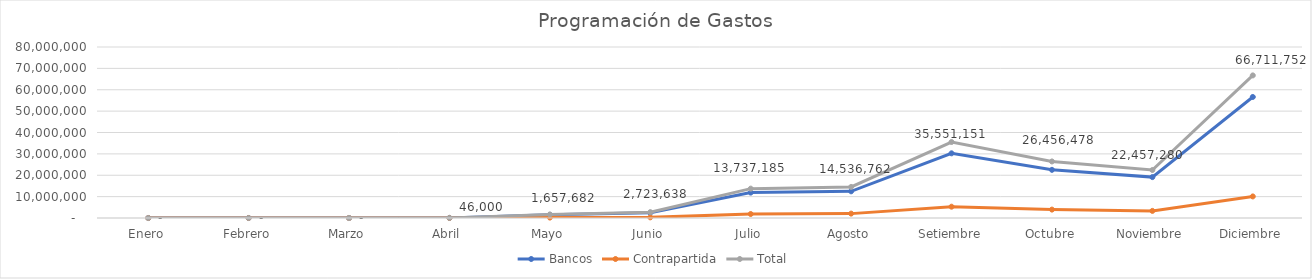
| Category | Bancos | Contrapartida | Total |
|---|---|---|---|
| Enero | 0 | 0 | 0 |
| Febrero | 0 | 0 | 0 |
| Marzo | 0 | 0 | 0 |
| Abril | 42593 | 3407 | 46000 |
| Mayo | 1464643.764 | 193037.944 | 1657681.709 |
| Junio | 2414125.31 | 309513.027 | 2723638.337 |
| Julio | 11878397.474 | 1858787.917 | 13737185.391 |
| Agosto | 12488391.723 | 2048370.638 | 14536762.361 |
| Setiembre | 30262029.672 | 5289120.849 | 35551150.521 |
| Octubre | 22528603.085 | 3927874.852 | 26456477.937 |
| Noviembre | 19134258.654 | 3323021.015 | 22457279.669 |
| Diciembre | 56623775.194 | 10087977.196 | 66711752.389 |